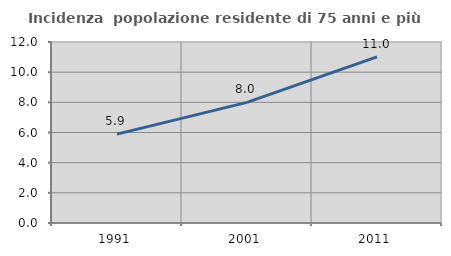
| Category | Incidenza  popolazione residente di 75 anni e più |
|---|---|
| 1991.0 | 5.892 |
| 2001.0 | 7.999 |
| 2011.0 | 11.01 |